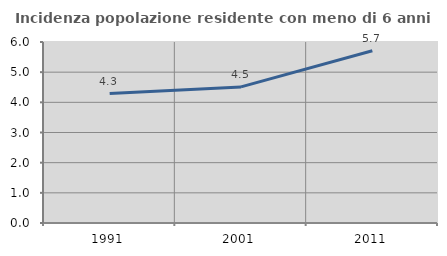
| Category | Incidenza popolazione residente con meno di 6 anni |
|---|---|
| 1991.0 | 4.289 |
| 2001.0 | 4.511 |
| 2011.0 | 5.71 |